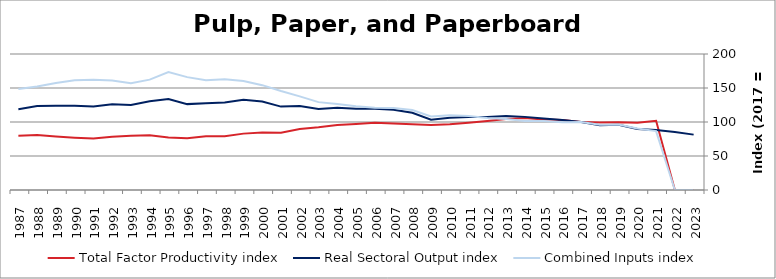
| Category | Total Factor Productivity index | Real Sectoral Output index | Combined Inputs index |
|---|---|---|---|
| 2023.0 | 0 | 81.421 | 0 |
| 2022.0 | 0 | 85.353 | 0 |
| 2021.0 | 101.85 | 88.24 | 86.637 |
| 2020.0 | 98.944 | 89.586 | 90.542 |
| 2019.0 | 99.505 | 95.969 | 96.446 |
| 2018.0 | 99.359 | 95.247 | 95.862 |
| 2017.0 | 100 | 100 | 100 |
| 2016.0 | 103.073 | 102.83 | 99.764 |
| 2015.0 | 103.56 | 105.16 | 101.544 |
| 2014.0 | 105.924 | 107.539 | 101.525 |
| 2013.0 | 104.266 | 108.704 | 104.256 |
| 2012.0 | 101.399 | 107.266 | 105.787 |
| 2011.0 | 98.768 | 107.409 | 108.749 |
| 2010.0 | 96.729 | 106.252 | 109.845 |
| 2009.0 | 95.769 | 103.447 | 108.018 |
| 2008.0 | 96.558 | 113.578 | 117.627 |
| 2007.0 | 97.927 | 118.069 | 120.569 |
| 2006.0 | 98.91 | 119.662 | 120.98 |
| 2005.0 | 97.149 | 119.543 | 123.051 |
| 2004.0 | 95.576 | 120.775 | 126.366 |
| 2003.0 | 92.27 | 119.231 | 129.221 |
| 2002.0 | 89.802 | 123.646 | 137.688 |
| 2001.0 | 84.304 | 122.66 | 145.497 |
| 2000.0 | 84.397 | 130.115 | 154.169 |
| 1999.0 | 82.903 | 132.787 | 160.171 |
| 1998.0 | 78.95 | 128.627 | 162.923 |
| 1997.0 | 79.13 | 127.722 | 161.408 |
| 1996.0 | 76.082 | 126.292 | 165.996 |
| 1995.0 | 77.103 | 133.656 | 173.346 |
| 1994.0 | 80.492 | 130.645 | 162.309 |
| 1993.0 | 79.624 | 125.063 | 157.068 |
| 1992.0 | 78.151 | 125.959 | 161.174 |
| 1991.0 | 75.611 | 122.676 | 162.246 |
| 1990.0 | 76.879 | 123.992 | 161.283 |
| 1989.0 | 78.735 | 123.775 | 157.204 |
| 1988.0 | 81.053 | 123.36 | 152.197 |
| 1987.0 | 79.806 | 118.612 | 148.624 |